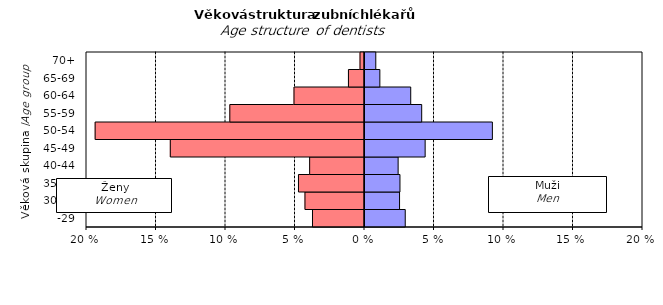
| Category | ženy | muži |
|---|---|---|
| -29 | -3.741 | 2.967 |
| 30-34 | -4.282 | 2.557 |
| 35-39 | -4.749 | 2.587 |
| 40-44 | -3.946 | 2.455 |
| 45-49 | -13.97 | 4.399 |
| 50-54 | -19.377 | 9.236 |
| 55-59 | -9.689 | 4.15 |
| 60-64 | -5.071 | 3.361 |
| 65-69 | -1.154 | 1.14 |
|  70+ | -0.321 | 0.848 |